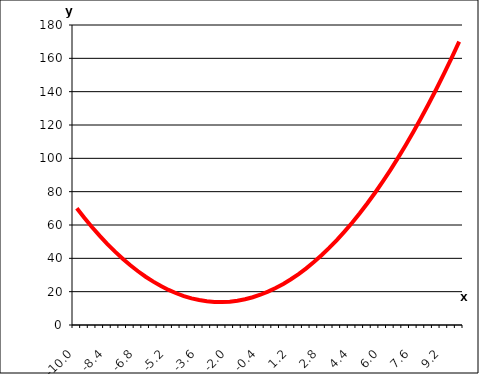
| Category | Series 1 |
|---|---|
| -10.0 | 70 |
| -9.6 | 64.16 |
| -9.2 | 58.64 |
| -8.799999999999999 | 53.44 |
| -8.399999999999999 | 48.56 |
| -7.999999999999998 | 44 |
| -7.599999999999998 | 39.76 |
| -7.1999999999999975 | 35.84 |
| -6.799999999999997 | 32.24 |
| -6.399999999999997 | 28.96 |
| -5.9999999999999964 | 26 |
| -5.599999999999996 | 23.36 |
| -5.199999999999996 | 21.04 |
| -4.799999999999995 | 19.04 |
| -4.399999999999995 | 17.36 |
| -3.999999999999995 | 16 |
| -3.599999999999995 | 14.96 |
| -3.1999999999999953 | 14.24 |
| -2.7999999999999954 | 13.84 |
| -2.3999999999999955 | 13.76 |
| -1.9999999999999956 | 14 |
| -1.5999999999999956 | 14.56 |
| -1.1999999999999957 | 15.44 |
| -0.7999999999999957 | 16.64 |
| -0.3999999999999957 | 18.16 |
| 4.3298697960381105e-15 | 20 |
| 0.40000000000000435 | 22.16 |
| 0.8000000000000044 | 24.64 |
| 1.2000000000000044 | 27.44 |
| 1.6000000000000045 | 30.56 |
| 2.0000000000000044 | 34 |
| 2.4000000000000044 | 37.76 |
| 2.8000000000000043 | 41.84 |
| 3.200000000000004 | 46.24 |
| 3.600000000000004 | 50.96 |
| 4.000000000000004 | 56 |
| 4.400000000000005 | 61.36 |
| 4.800000000000005 | 67.04 |
| 5.2000000000000055 | 73.04 |
| 5.600000000000006 | 79.36 |
| 6.000000000000006 | 86 |
| 6.400000000000007 | 92.96 |
| 6.800000000000007 | 100.24 |
| 7.200000000000007 | 107.84 |
| 7.600000000000008 | 115.76 |
| 8.000000000000007 | 124 |
| 8.400000000000007 | 132.56 |
| 8.800000000000008 | 141.44 |
| 9.200000000000008 | 150.64 |
| 9.600000000000009 | 160.16 |
| 10.000000000000009 | 170 |